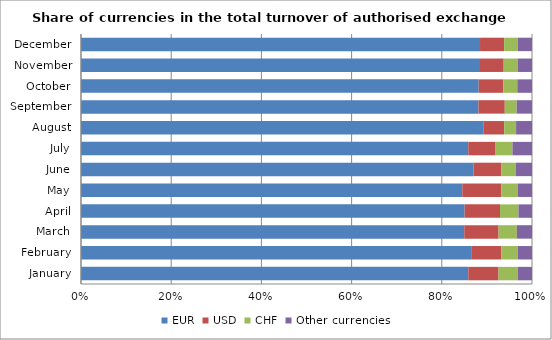
| Category | EUR | USD | CHF | Other currencies |
|---|---|---|---|---|
| January | 85.873 | 6.711 | 4.286 | 3.13 |
| February | 86.522 | 6.646 | 3.702 | 3.13 |
| March | 84.983 | 7.607 | 4.05 | 3.36 |
| April | 85.056 | 7.851 | 4.091 | 3.003 |
| May | 84.548 | 8.632 | 3.639 | 3.181 |
| June | 87.059 | 6.174 | 3.21 | 3.557 |
| July | 85.867 | 5.939 | 3.86 | 4.335 |
| August | 89.206 | 4.626 | 2.64 | 3.528 |
| September | 88.125 | 5.838 | 2.632 | 3.405 |
| October | 88.175 | 5.449 | 3.123 | 3.254 |
| November | 88.261 | 5.464 | 3.152 | 3.124 |
| December | 88.476 | 5.35 | 3.045 | 3.129 |